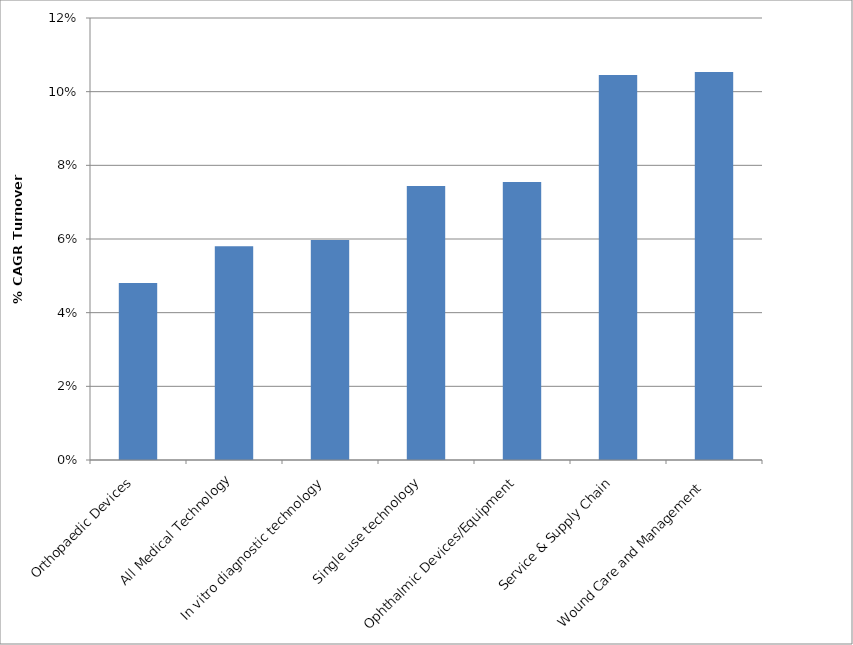
| Category | % CAGR 2009-2014 Turnover |
|---|---|
| Orthopaedic Devices | 0.048 |
| All Medical Technology | 0.058 |
| In vitro diagnostic technology | 0.06 |
| Single use technology  | 0.074 |
| Ophthalmic Devices/Equipment | 0.075 |
| Service & Supply Chain | 0.105 |
| Wound Care and Management  | 0.105 |